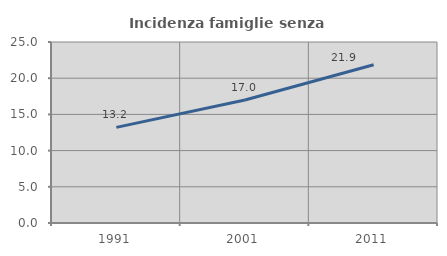
| Category | Incidenza famiglie senza nuclei |
|---|---|
| 1991.0 | 13.205 |
| 2001.0 | 16.987 |
| 2011.0 | 21.856 |